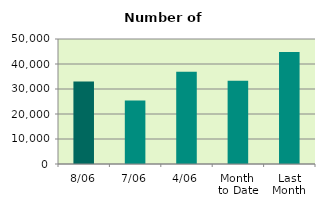
| Category | Series 0 |
|---|---|
| 8/06 | 33030 |
| 7/06 | 25366 |
| 4/06 | 36948 |
| Month 
to Date | 33270 |
| Last
Month | 44751.81 |